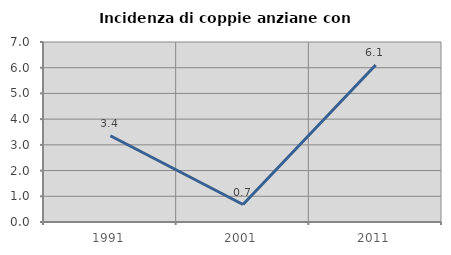
| Category | Incidenza di coppie anziane con figli |
|---|---|
| 1991.0 | 3.356 |
| 2001.0 | 0.68 |
| 2011.0 | 6.107 |